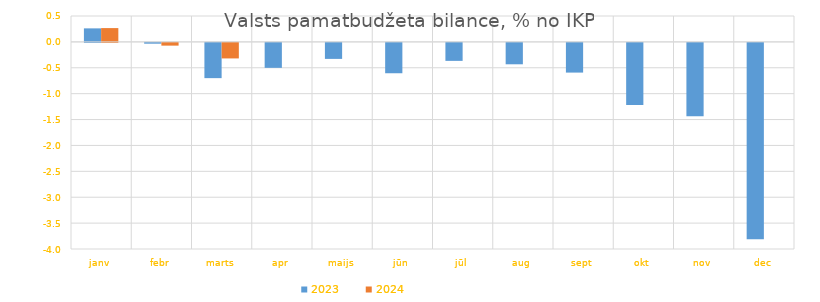
| Category | 2023 | 2024 |
|---|---|---|
| janv | 0.261 | 0.267 |
| febr | -0.015 | -0.053 |
| marts | -0.681 | -0.3 |
| apr | -0.482 | 0 |
| maijs | -0.309 | 0 |
| jūn | -0.586 | 0 |
| jūl | -0.347 | 0 |
| aug | -0.413 | 0 |
| sept | -0.574 | 0 |
| okt | -1.202 | 0 |
| nov | -1.419 | 0 |
| dec | -3.794 | 0 |